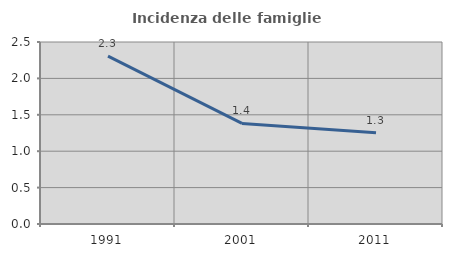
| Category | Incidenza delle famiglie numerose |
|---|---|
| 1991.0 | 2.306 |
| 2001.0 | 1.381 |
| 2011.0 | 1.252 |